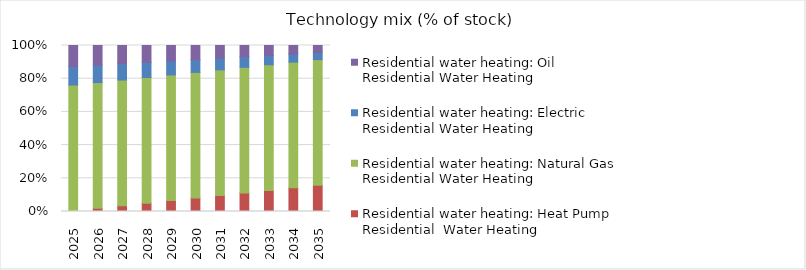
| Category | Residential water heating: Heat Pump Residential  Water Heating | Residential water heating: Natural Gas Residential Water Heating | Residential water heating: Electric Residential Water Heating | Residential water heating: Oil Residential Water Heating |
|---|---|---|---|---|
| 2025.0 | 0.005 | 0.757 | 0.112 | 0.127 |
| 2026.0 | 0.02 | 0.757 | 0.105 | 0.118 |
| 2027.0 | 0.035 | 0.757 | 0.098 | 0.11 |
| 2028.0 | 0.05 | 0.757 | 0.091 | 0.102 |
| 2029.0 | 0.066 | 0.757 | 0.084 | 0.093 |
| 2030.0 | 0.081 | 0.757 | 0.077 | 0.085 |
| 2031.0 | 0.096 | 0.757 | 0.07 | 0.076 |
| 2032.0 | 0.112 | 0.757 | 0.063 | 0.068 |
| 2033.0 | 0.127 | 0.757 | 0.056 | 0.06 |
| 2034.0 | 0.143 | 0.757 | 0.049 | 0.051 |
| 2035.0 | 0.158 | 0.757 | 0.042 | 0.043 |